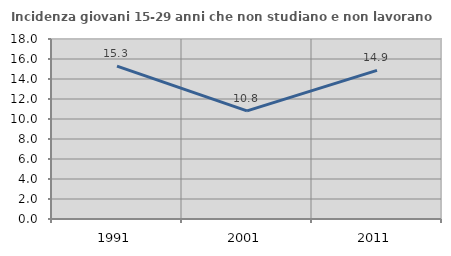
| Category | Incidenza giovani 15-29 anni che non studiano e non lavorano  |
|---|---|
| 1991.0 | 15.287 |
| 2001.0 | 10.807 |
| 2011.0 | 14.865 |